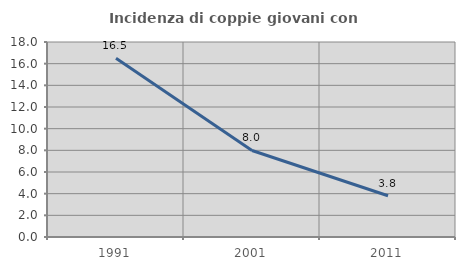
| Category | Incidenza di coppie giovani con figli |
|---|---|
| 1991.0 | 16.499 |
| 2001.0 | 7.985 |
| 2011.0 | 3.809 |